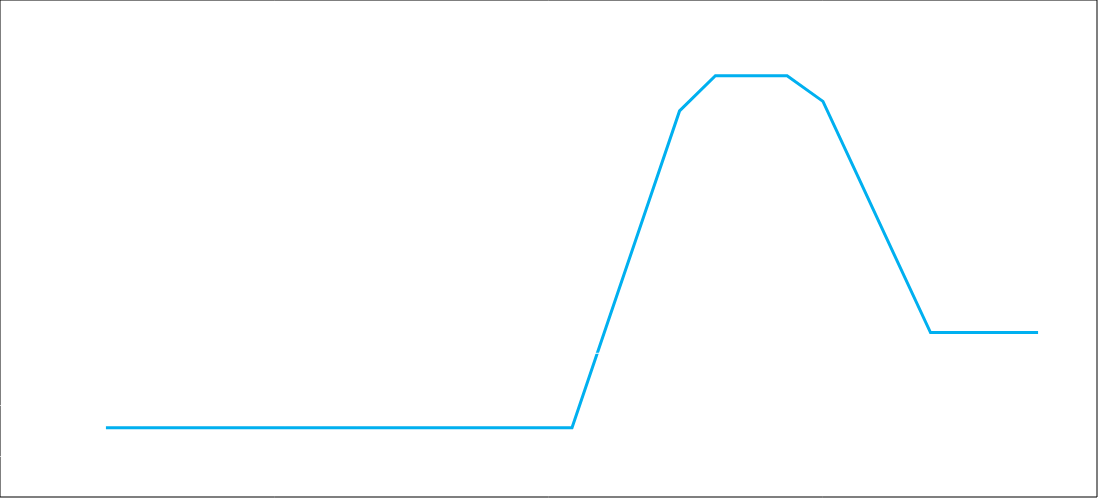
| Category | $Gain |
|---|---|
| 70.5 | -14477 |
| 72.0 | -14477 |
| 73.5 | -14477 |
| 75.0 | -14477 |
| 76.5 | -14477 |
| 78.0 | -14477 |
| 79.5 | -14477 |
| 81.0 | -14477 |
| 82.5 | -14477 |
| 84.0 | -14477 |
| 85.5 | -14477 |
| 87.0 | -14477 |
| 88.5 | -14477 |
| 90.0 | -14477 |
| 91.5 | 6073 |
| 93.0 | 26623 |
| 94.5 | 47173 |
| 96.0 | 54023 |
| 97.5 | 54023 |
| 99.0 | 54023 |
| 100.5 | 49023 |
| 102.0 | 34023 |
| 103.5 | 19023 |
| 105.0 | 4023 |
| 106.5 | 4023 |
| 108.0 | 4023 |
| 109.5 | 4023 |